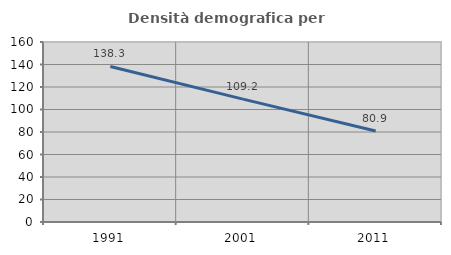
| Category | Densità demografica |
|---|---|
| 1991.0 | 138.259 |
| 2001.0 | 109.205 |
| 2011.0 | 80.902 |